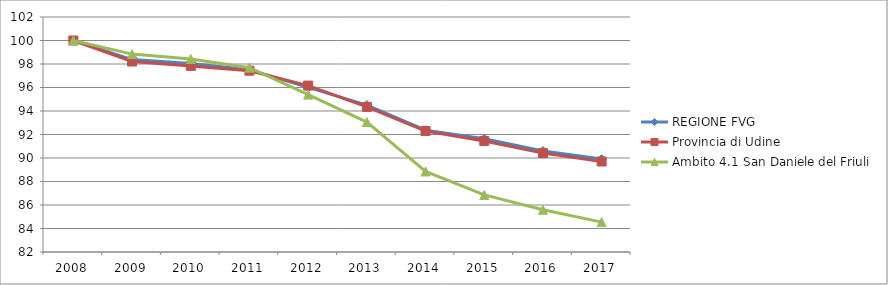
| Category | REGIONE FVG | Provincia di Udine | Ambito 4.1 San Daniele del Friuli |
|---|---|---|---|
| 2008.0 | 100 | 100 | 100 |
| 2009.0 | 98.378 | 98.213 | 98.843 |
| 2010.0 | 98.049 | 97.839 | 98.423 |
| 2011.0 | 97.515 | 97.431 | 97.687 |
| 2012.0 | 96.012 | 96.162 | 95.394 |
| 2013.0 | 94.5 | 94.348 | 93.06 |
| 2014.0 | 92.37 | 92.296 | 88.854 |
| 2015.0 | 91.632 | 91.451 | 86.856 |
| 2016.0 | 90.595 | 90.414 | 85.594 |
| 2017.0 | 89.908 | 89.702 | 84.543 |